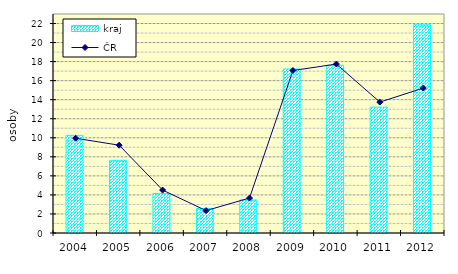
| Category | kraj |
|---|---|
| 2004.0 | 10.254 |
| 2005.0 | 7.631 |
| 2006.0 | 4.148 |
| 2007.0 | 2.567 |
| 2008.0 | 3.474 |
| 2009.0 | 17.223 |
| 2010.0 | 17.618 |
| 2011.0 | 13.216 |
| 2012.0 | 21.872 |